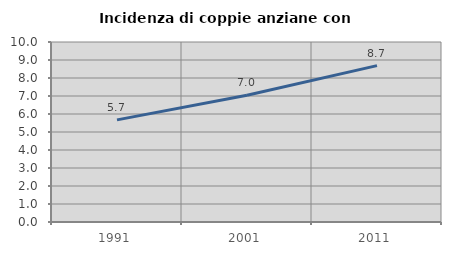
| Category | Incidenza di coppie anziane con figli |
|---|---|
| 1991.0 | 5.673 |
| 2001.0 | 7.042 |
| 2011.0 | 8.686 |